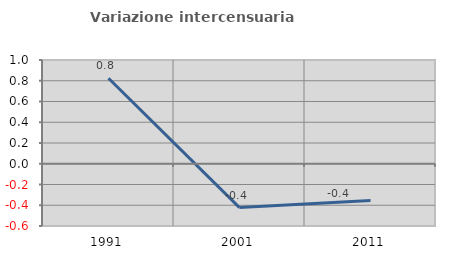
| Category | Variazione intercensuaria annua |
|---|---|
| 1991.0 | 0.824 |
| 2001.0 | -0.423 |
| 2011.0 | -0.354 |